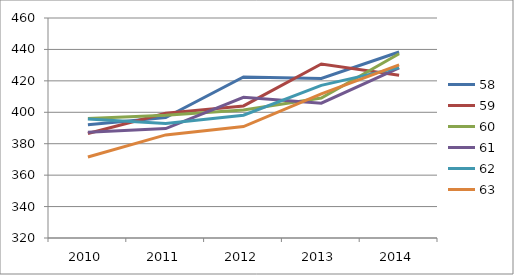
| Category | 58 | 59 | 60 | 61 | 62 | 63 |
|---|---|---|---|---|---|---|
| 2010.0 | 391.996 | 386.52 | 396.025 | 387.222 | 395.75 | 371.56 |
| 2011.0 | 396.698 | 399.385 | 398.082 | 389.645 | 392.841 | 385.613 |
| 2012.0 | 422.475 | 404.05 | 401.428 | 409.577 | 398.121 | 390.925 |
| 2013.0 | 421.488 | 430.696 | 409.082 | 405.774 | 417.111 | 411.696 |
| 2014.0 | 438.352 | 423.627 | 437.284 | 428.281 | 428.404 | 430.189 |